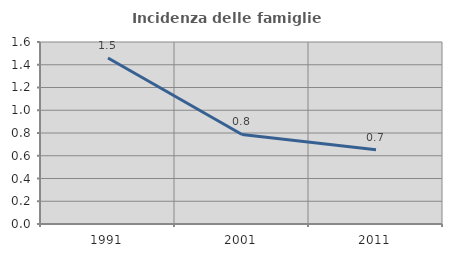
| Category | Incidenza delle famiglie numerose |
|---|---|
| 1991.0 | 1.459 |
| 2001.0 | 0.787 |
| 2011.0 | 0.653 |